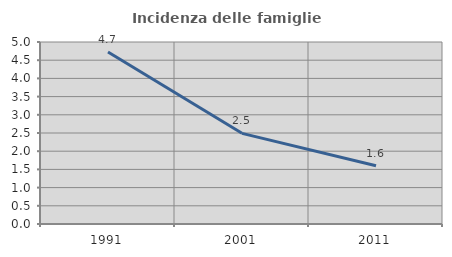
| Category | Incidenza delle famiglie numerose |
|---|---|
| 1991.0 | 4.725 |
| 2001.0 | 2.491 |
| 2011.0 | 1.601 |